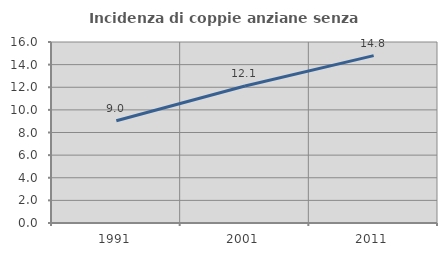
| Category | Incidenza di coppie anziane senza figli  |
|---|---|
| 1991.0 | 9.043 |
| 2001.0 | 12.106 |
| 2011.0 | 14.798 |